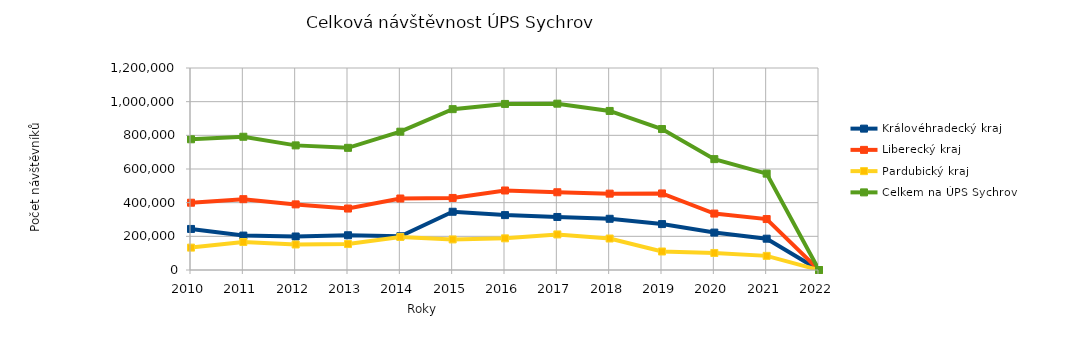
| Category | Královéhradecký kraj | Liberecký kraj | Pardubický kraj | Celkem na ÚPS Sychrov |
|---|---|---|---|---|
| 2010.0 | 243910 | 399672 | 133004 | 776586 |
| 2011.0 | 204481 | 420780 | 166238 | 791499 |
| 2012.0 | 199025 | 389781 | 151509 | 740315 |
| 2013.0 | 206419 | 365108 | 154165 | 725692 |
| 2014.0 | 200438 | 424718 | 196473 | 821629 |
| 2015.0 | 345970 | 428023 | 181567 | 955560 |
| 2016.0 | 326137 | 472318 | 188108 | 986563 |
| 2017.0 | 314983 | 461803 | 211268 | 988054 |
| 2018.0 | 304267 | 453568 | 187017 | 944852 |
| 2019.0 | 272720 | 454785 | 109949 | 837454 |
| 2020.0 | 222238 | 335261 | 101211 | 658710 |
| 2021.0 | 185934 | 302574 | 83925 | 572433 |
| 2022.0 | 0 | 0 | 0 | 0 |